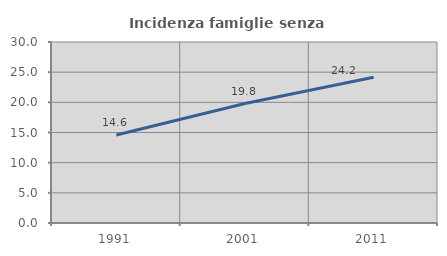
| Category | Incidenza famiglie senza nuclei |
|---|---|
| 1991.0 | 14.595 |
| 2001.0 | 19.803 |
| 2011.0 | 24.153 |